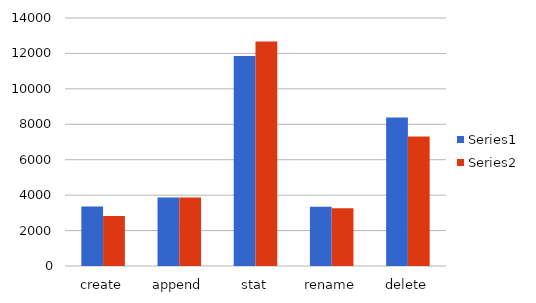
| Category | Series 0 | Series 1 |
|---|---|---|
| create | 3352 | 2816 |
| append | 3861 | 3871 |
| stat | 11861 | 12680 |
| rename | 3347 | 3265 |
| delete | 8381 | 7309 |